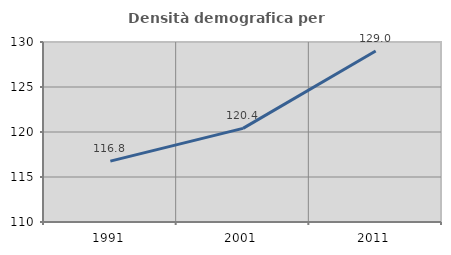
| Category | Densità demografica |
|---|---|
| 1991.0 | 116.766 |
| 2001.0 | 120.403 |
| 2011.0 | 129 |